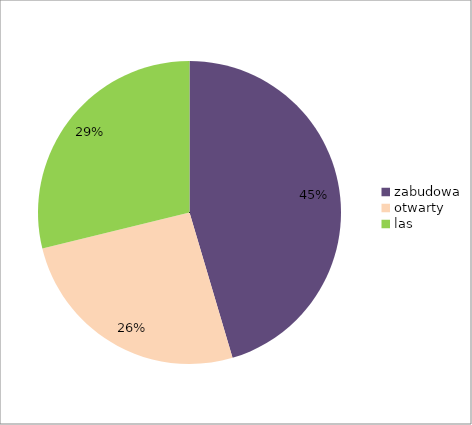
| Category | Series 0 |
|---|---|
| zabudowa | 0.454 |
| otwarty | 0.258 |
| las | 0.288 |